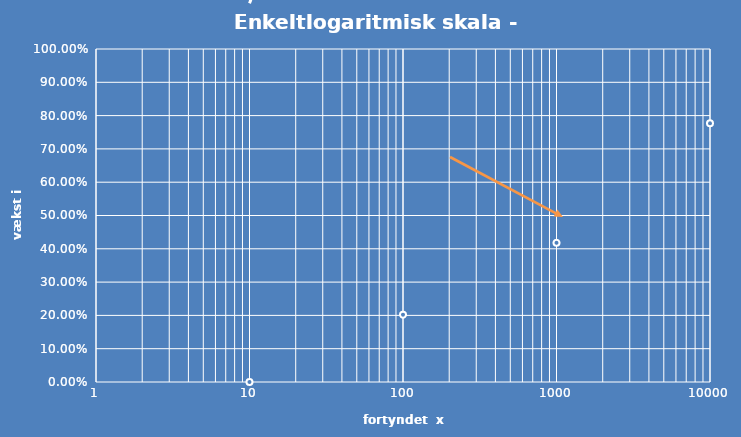
| Category | Series 0 |
|---|---|
| 10.0 | 0 |
| 100.0 | 0.202 |
| 1000.0 | 0.418 |
| 10000.0 | 0.777 |